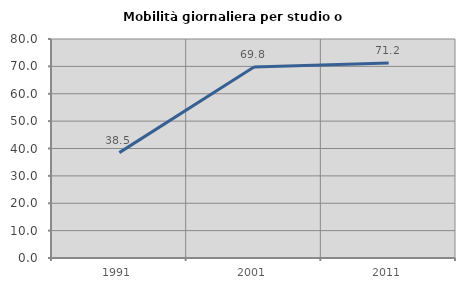
| Category | Mobilità giornaliera per studio o lavoro |
|---|---|
| 1991.0 | 38.491 |
| 2001.0 | 69.754 |
| 2011.0 | 71.196 |